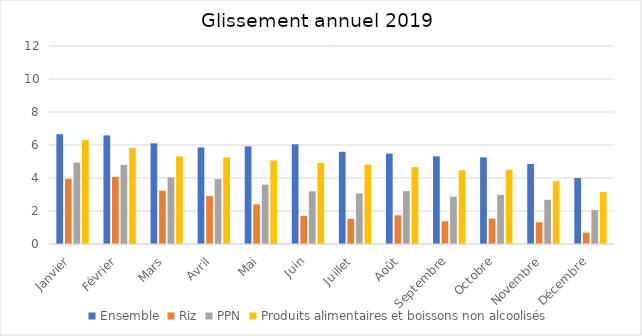
| Category | Ensemble | Riz | PPN | Produits alimentaires et boissons non alcoolisés |
|---|---|---|---|---|
| Janvier | 6.654 | 3.947 | 4.931 | 6.314 |
| Février | 6.581 | 4.074 | 4.789 | 5.817 |
| Mars | 6.102 | 3.226 | 4.034 | 5.311 |
| Avril | 5.853 | 2.903 | 3.939 | 5.246 |
| Mai | 5.922 | 2.402 | 3.599 | 5.06 |
| Juin | 6.041 | 1.701 | 3.197 | 4.914 |
| Juillet | 5.589 | 1.527 | 3.067 | 4.809 |
| Août | 5.482 | 1.74 | 3.205 | 4.656 |
| Septembre | 5.314 | 1.377 | 2.876 | 4.465 |
| Octobre | 5.25 | 1.531 | 2.969 | 4.503 |
| Novembre | 4.853 | 1.316 | 2.68 | 3.813 |
| Décembre | 4.001 | 0.687 | 2.057 | 3.15 |